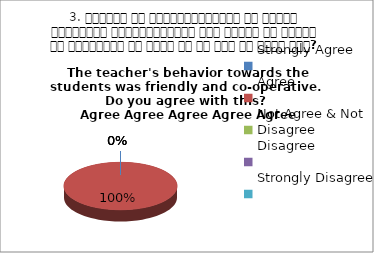
| Category | 3. शिक्षक का विद्यार्थियों के प्रति व्यव्हार मित्रतापूर्ण एवं सहयोग के भावना से परिपूर्ण था क्या आप इस बात से सहमत हैं? 
The teacher's behavior towards the students was friendly and co-operative.  Do you agree with this? 
 Agree Agree Agree Agree Agree |
|---|---|
| Strongly Agree | 0 |
| Agree | 4 |
| Not Agree & Not Disagree | 0 |
| Disagree | 0 |
| Strongly Disagree | 0 |